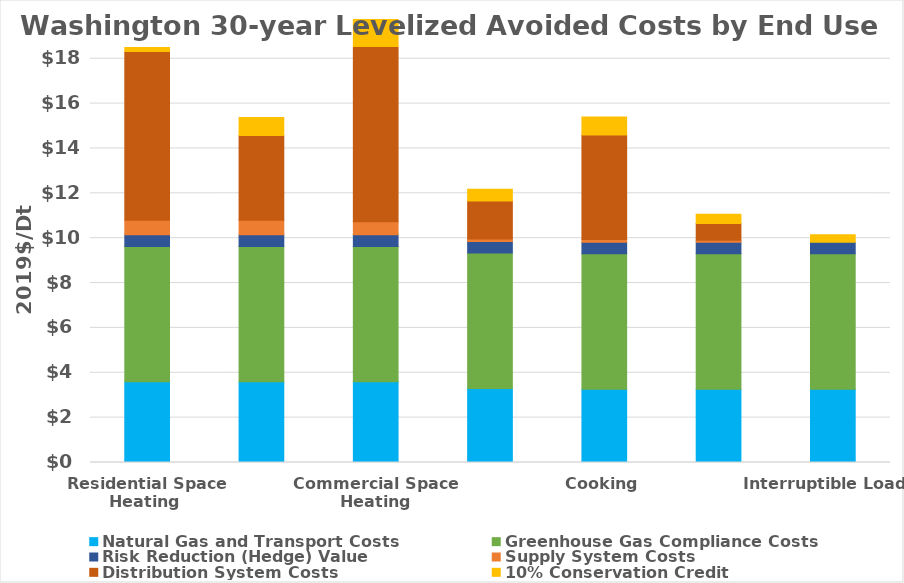
| Category | Natural Gas and Transport Costs | Greenhouse Gas Compliance Costs | Risk Reduction (Hedge) Value | Supply System Costs | Distribution System Costs | 10% Conservation Credit |
|---|---|---|---|---|---|---|
| Residential Space Heating  | 3.597 | 6.037 | 0.52 | 0.644 | 7.518 | 1.176 |
| Residential Hearths and Fireplaces | 3.597 | 6.037 | 0.52 | 0.644 | 3.783 | 0.802 |
| Commercial Space Heating | 3.597 | 6.037 | 0.52 | 0.575 | 9.066 | 1.324 |
| Water Heating | 3.298 | 6.037 | 0.52 | 0.107 | 1.699 | 0.515 |
| Cooking | 3.263 | 6.037 | 0.52 | 0.116 | 4.659 | 0.809 |
| Process Load | 3.263 | 6.037 | 0.52 | 0.089 | 0.747 | 0.415 |
| Interruptible Loads | 3.263 | 6.037 | 0.52 | 0 | 0 | 0.331 |